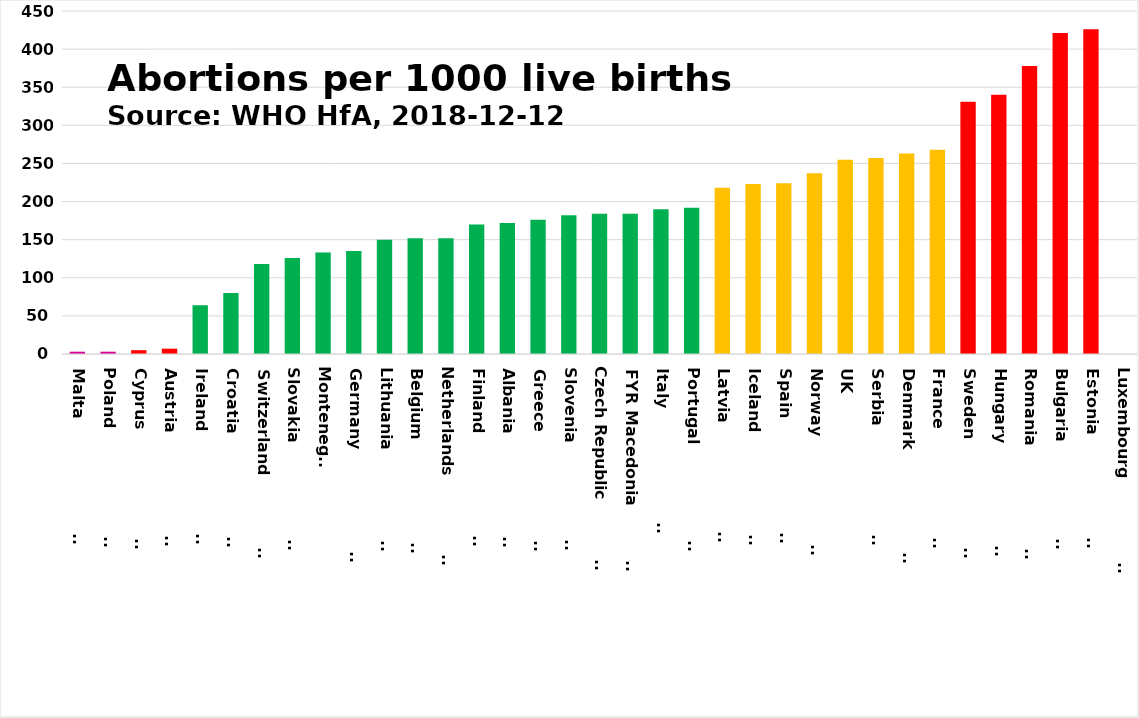
| Category | Series 0 |
|---|---|
| Malta                         | 3 |
| Poland                        | 3 |
| Cyprus                        | 5 |
| Austria                       | 7 |
| Ireland                       | 64 |
| Croatia                       | 80 |
| Switzerland                   | 118 |
| Slovakia                      | 126 |
| Montenegro | 133 |
| Germany                       | 135 |
| Lithuania                     | 150 |
| Belgium                       | 152 |
| Netherlands                   | 152 |
| Finland                       | 170 |
| Albania                       | 172 |
| Greece                        | 176 |
| Slovenia                      | 182 |
| Czech Republic                | 184 |
| FYR Macedonia                | 184 |
| Italy                         | 190 |
| Portugal                      | 192 |
| Latvia                        | 218 |
| Iceland                       | 223 |
| Spain                         | 224 |
| Norway                        | 237 |
| UK | 255 |
| Serbia                        | 257 |
| Denmark                       | 263 |
| France                        | 268 |
| Sweden                        | 331 |
| Hungary                       | 340 |
| Romania                       | 378 |
| Bulgaria                      | 421 |
| Estonia                       | 426 |
| Luxembourg                    | 0 |